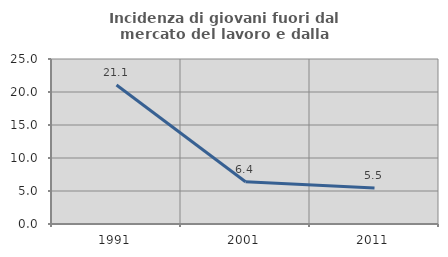
| Category | Incidenza di giovani fuori dal mercato del lavoro e dalla formazione  |
|---|---|
| 1991.0 | 21.053 |
| 2001.0 | 6.41 |
| 2011.0 | 5.455 |